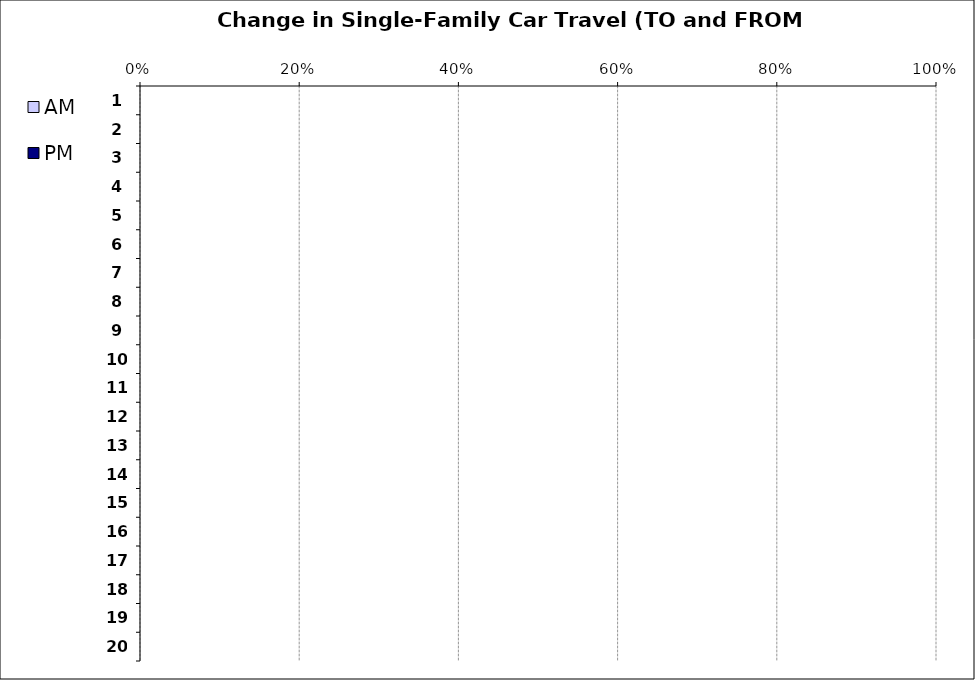
| Category | AM | PM |
|---|---|---|
| 1.0 | 0 | 0 |
| 2.0 | 0 | 0 |
| 3.0 | 0 | 0 |
| 4.0 | 0 | 0 |
| 5.0 | 0 | 0 |
| 6.0 | 0 | 0 |
| 7.0 | 0 | 0 |
| 8.0 | 0 | 0 |
| 9.0 | 0 | 0 |
| 10.0 | 0 | 0 |
| 11.0 | 0 | 0 |
| 12.0 | 0 | 0 |
| 13.0 | 0 | 0 |
| 14.0 | 0 | 0 |
| 15.0 | 0 | 0 |
| 16.0 | 0 | 0 |
| 17.0 | 0 | 0 |
| 18.0 | 0 | 0 |
| 19.0 | 0 | 0 |
| 20.0 | 0 | 0 |